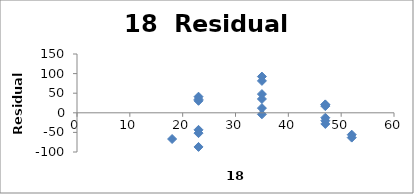
| Category | Series 0 |
|---|---|
| 35.0 | -3.823 |
| 52.0 | -55.854 |
| 52.0 | -63.261 |
| 18.0 | -66.842 |
| 35.0 | 11.945 |
| 35.0 | 47.72 |
| 35.0 | 92.407 |
| 23.0 | 41.033 |
| 23.0 | 34.263 |
| 47.0 | -12.553 |
| 47.0 | -28.447 |
| 47.0 | -20.123 |
| 23.0 | 30.605 |
| 23.0 | -43.448 |
| 23.0 | -87.049 |
| 23.0 | -51.91 |
| 47.0 | 17.058 |
| 47.0 | 20.153 |
| 47.0 | 21.459 |
| 35.0 | 81.387 |
| 35.0 | 35.282 |